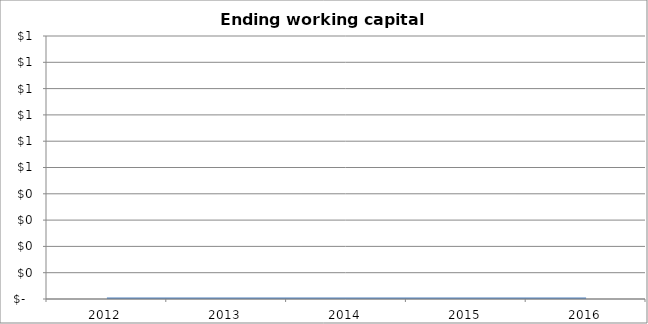
| Category | Ending working capital [A-B] |
|---|---|
| 2012.0 | 0 |
| 2013.0 | 0 |
| 2014.0 | 0 |
| 2015.0 | 0 |
| 2016.0 | 0 |